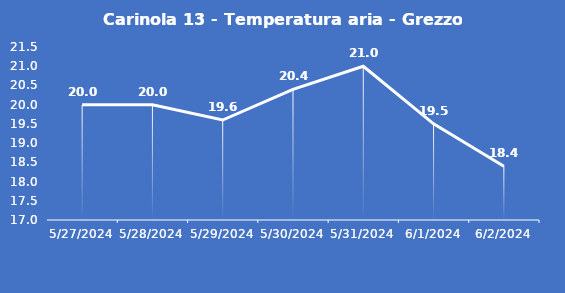
| Category | Carinola 13 - Temperatura aria - Grezzo (°C) |
|---|---|
| 5/27/24 | 20 |
| 5/28/24 | 20 |
| 5/29/24 | 19.6 |
| 5/30/24 | 20.4 |
| 5/31/24 | 21 |
| 6/1/24 | 19.5 |
| 6/2/24 | 18.4 |